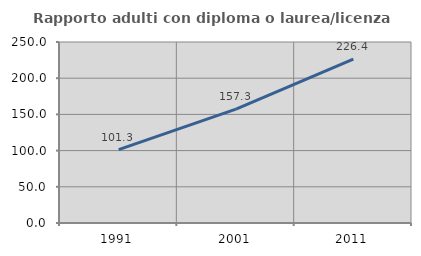
| Category | Rapporto adulti con diploma o laurea/licenza media  |
|---|---|
| 1991.0 | 101.276 |
| 2001.0 | 157.348 |
| 2011.0 | 226.436 |